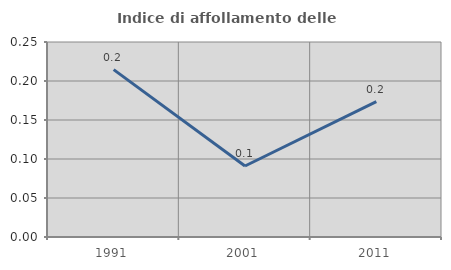
| Category | Indice di affollamento delle abitazioni  |
|---|---|
| 1991.0 | 0.215 |
| 2001.0 | 0.091 |
| 2011.0 | 0.174 |